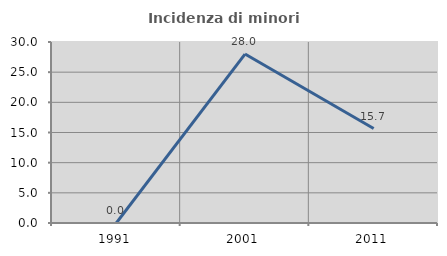
| Category | Incidenza di minori stranieri |
|---|---|
| 1991.0 | 0 |
| 2001.0 | 28 |
| 2011.0 | 15.663 |